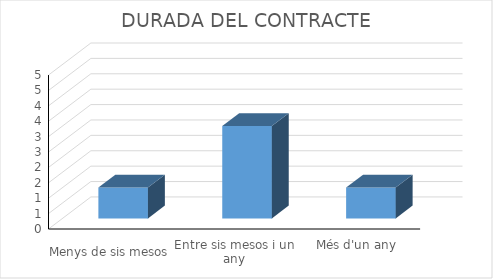
| Category | Series 0 |
|---|---|
| Menys de sis mesos | 1 |
| Entre sis mesos i un any | 3 |
| Més d'un any | 1 |